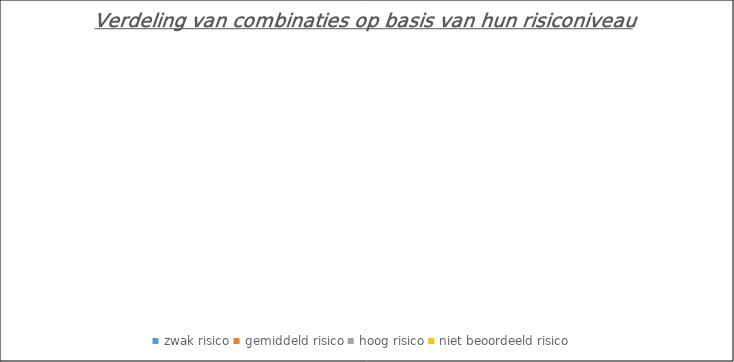
| Category | Series 0 |
|---|---|
| zwak risico | 0 |
| gemiddeld risico | 0 |
| hoog risico | 0 |
| niet beoordeeld risico | 0 |